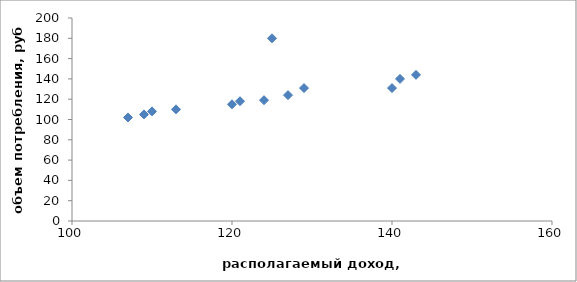
| Category | y |
|---|---|
| 107.0 | 102 |
| 109.0 | 105 |
| 110.0 | 108 |
| 113.0 | 110 |
| 120.0 | 115 |
| 121.0 | 118 |
| 124.0 | 119 |
| 125.0 | 180 |
| 127.0 | 124 |
| 129.0 | 131 |
| 140.0 | 131 |
| 141.0 | 140 |
| 143.0 | 144 |